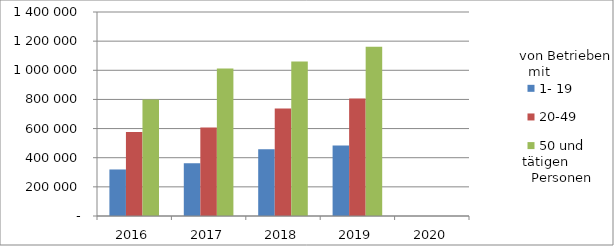
| Category | 1- 19 | 20-49 | 50 und mehr |
|---|---|---|---|
| 2016.0 | 319340.725 | 575670.955 | 800299.036 |
| 2017.0 | 362148.834 | 608159.206 | 1012092.607 |
| 2018.0 | 457961.358 | 737580.151 | 1061014.859 |
| 2019.0 | 483675.502 | 806796.943 | 1161609.68 |
| 2020.0 | 0 | 0 | 0 |